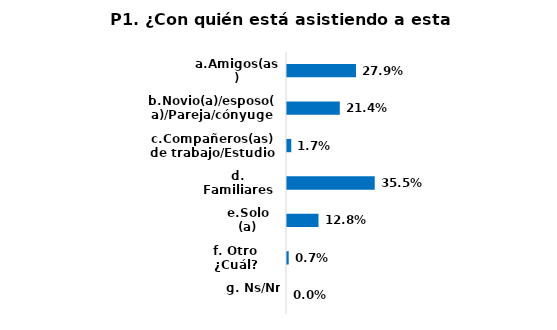
| Category | Series 0 |
|---|---|
| a.Amigos(as) | 0.279 |
| b.Novio(a)/esposo(a)/Pareja/cónyuge | 0.214 |
| c.Compañeros(as) de trabajo/Estudio | 0.017 |
| d. Familiares | 0.355 |
| e.Solo (a) | 0.128 |
| f. Otro ¿Cuál? | 0.007 |
| g. Ns/Nr | 0 |